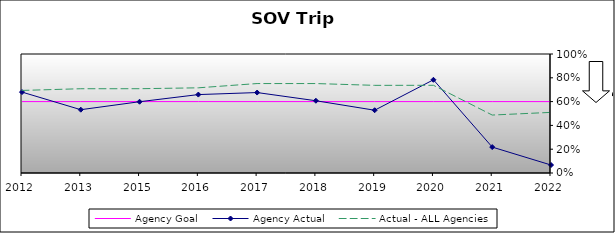
| Category | Agency Goal | Agency Actual | Actual - ALL Agencies |
|---|---|---|---|
| 2012.0 | 0.6 | 0.68 | 0.694 |
| 2013.0 | 0.6 | 0.532 | 0.708 |
| 2015.0 | 0.6 | 0.599 | 0.708 |
| 2016.0 | 0.6 | 0.659 | 0.716 |
| 2017.0 | 0.6 | 0.676 | 0.752 |
| 2018.0 | 0.6 | 0.607 | 0.752 |
| 2019.0 | 0.6 | 0.528 | 0.736 |
| 2020.0 | 0.6 | 0.783 | 0.737 |
| 2021.0 | 0.6 | 0.218 | 0.487 |
| 2022.0 | 0.6 | 0.067 | 0.509 |